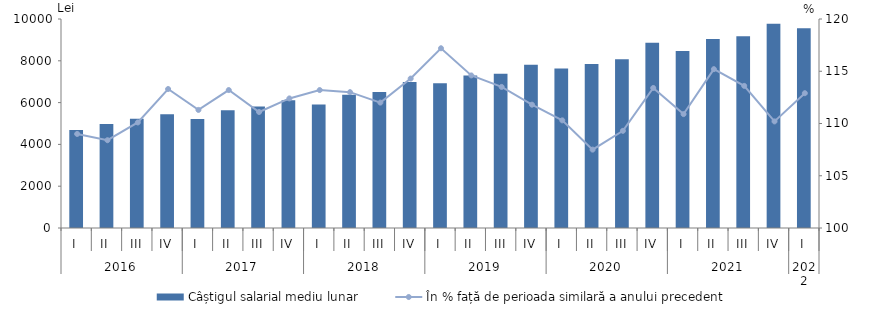
| Category | Câștigul salarial mediu lunar |
|---|---|
| 0 | 4689.2 |
| 1 | 4980.7 |
| 2 | 5229.2 |
| 3 | 5437.4 |
| 4 | 5218.9 |
| 5 | 5636.7 |
| 6 | 5809.1 |
| 7 | 6113.6 |
| 8 | 5906.5 |
| 9 | 6369.8 |
| 10 | 6507.3 |
| 11 | 6987.5 |
| 12 | 6923 |
| 13 | 7302.6 |
| 14 | 7385 |
| 15 | 7813.1 |
| 16 | 7633.9 |
| 17 | 7849 |
| 18 | 8074.3 |
| 19 | 8859.9 |
| 20 | 8468.6 |
| 21 | 9044.5 |
| 22 | 9175.7 |
| 23 | 9767.6 |
| 24 | 9560.8 |